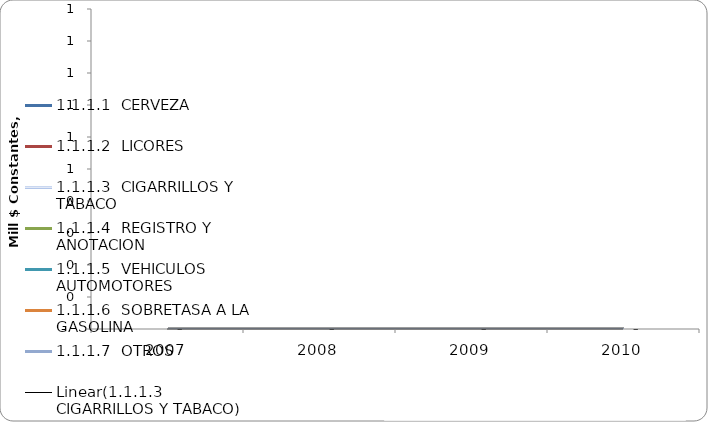
| Category | 1.1.1.1  CERVEZA | 1.1.1.2  LICORES | 1.1.1.3  CIGARRILLOS Y TABACO | 1.1.1.4  REGISTRO Y ANOTACION | 1.1.1.5  VEHICULOS AUTOMOTORES | 1.1.1.6  SOBRETASA A LA GASOLINA | 1.1.1.7  OTROS |
|---|---|---|---|---|---|---|---|
| 2007 | 0 | 0 | 0 | 0 | 0 | 0 | 0 |
| 2008 | 0 | 0 | 0 | 0 | 0 | 0 | 0 |
| 2009 | 0 | 0 | 0 | 0 | 0 | 0 | 0 |
| 2010 | 0 | 0 | 0 | 0 | 0 | 0 | 0 |